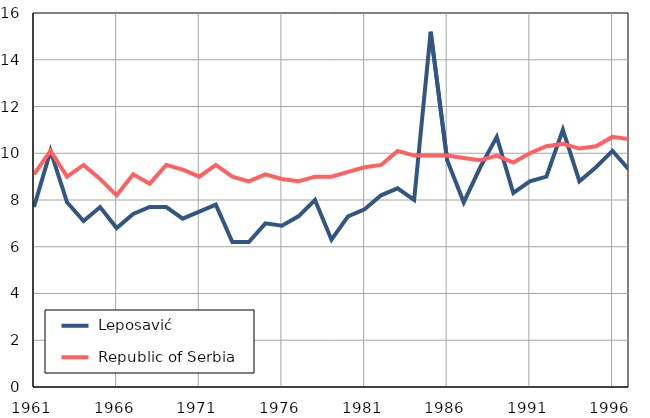
| Category |  Leposavić |  Republic of Serbia |
|---|---|---|
| 1961.0 | 7.7 | 9.1 |
| 1962.0 | 10.1 | 10.1 |
| 1963.0 | 7.9 | 9 |
| 1964.0 | 7.1 | 9.5 |
| 1965.0 | 7.7 | 8.9 |
| 1966.0 | 6.8 | 8.2 |
| 1967.0 | 7.4 | 9.1 |
| 1968.0 | 7.7 | 8.7 |
| 1969.0 | 7.7 | 9.5 |
| 1970.0 | 7.2 | 9.3 |
| 1971.0 | 7.5 | 9 |
| 1972.0 | 7.8 | 9.5 |
| 1973.0 | 6.2 | 9 |
| 1974.0 | 6.2 | 8.8 |
| 1975.0 | 7 | 9.1 |
| 1976.0 | 6.9 | 8.9 |
| 1977.0 | 7.3 | 8.8 |
| 1978.0 | 8 | 9 |
| 1979.0 | 6.3 | 9 |
| 1980.0 | 7.3 | 9.2 |
| 1981.0 | 7.6 | 9.4 |
| 1982.0 | 8.2 | 9.5 |
| 1983.0 | 8.5 | 10.1 |
| 1984.0 | 8 | 9.9 |
| 1985.0 | 15.2 | 9.9 |
| 1986.0 | 9.7 | 9.9 |
| 1987.0 | 7.9 | 9.8 |
| 1988.0 | 9.4 | 9.7 |
| 1989.0 | 10.7 | 9.9 |
| 1990.0 | 8.3 | 9.6 |
| 1991.0 | 8.8 | 10 |
| 1992.0 | 9 | 10.3 |
| 1993.0 | 11 | 10.4 |
| 1994.0 | 8.8 | 10.2 |
| 1995.0 | 9.4 | 10.3 |
| 1996.0 | 10.1 | 10.7 |
| 1997.0 | 9.3 | 10.6 |